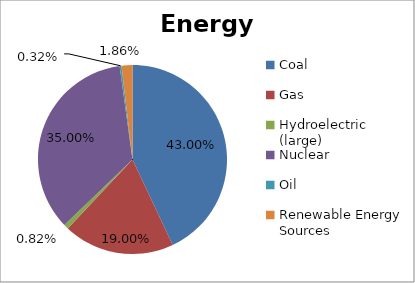
| Category | Energy Source |
|---|---|
| Coal | 0.43 |
| Gas | 0.19 |
| Hydroelectric (large) | 0.008 |
| Nuclear | 0.35 |
| Oil | 0.003 |
| Renewable Energy Sources | 0.019 |